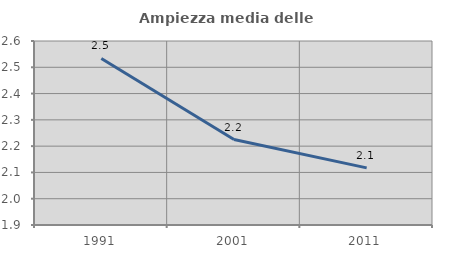
| Category | Ampiezza media delle famiglie |
|---|---|
| 1991.0 | 2.534 |
| 2001.0 | 2.225 |
| 2011.0 | 2.117 |